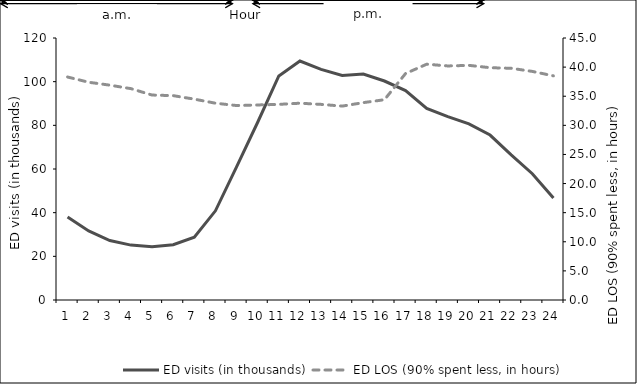
| Category | ED visits (in thousands) |
|---|---|
| 0 | 38.019 |
| 1 | 31.622 |
| 2 | 27.245 |
| 3 | 25.137 |
| 4 | 24.413 |
| 5 | 25.341 |
| 6 | 28.728 |
| 7 | 40.846 |
| 8 | 60.974 |
| 9 | 81.415 |
| 10 | 102.639 |
| 11 | 109.46 |
| 12 | 105.643 |
| 13 | 102.835 |
| 14 | 103.458 |
| 15 | 100.296 |
| 16 | 95.914 |
| 17 | 87.786 |
| 18 | 84.008 |
| 19 | 80.692 |
| 20 | 75.557 |
| 21 | 66.449 |
| 22 | 57.827 |
| 23 | 46.699 |